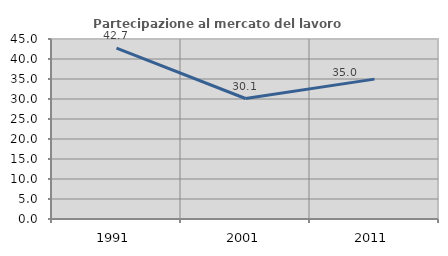
| Category | Partecipazione al mercato del lavoro  femminile |
|---|---|
| 1991.0 | 42.703 |
| 2001.0 | 30.12 |
| 2011.0 | 34.967 |